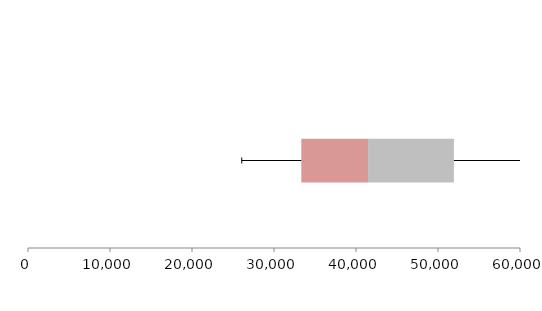
| Category | Series 1 | Series 2 | Series 3 |
|---|---|---|---|
| 0 | 33332.028 | 8135.378 | 10474.63 |